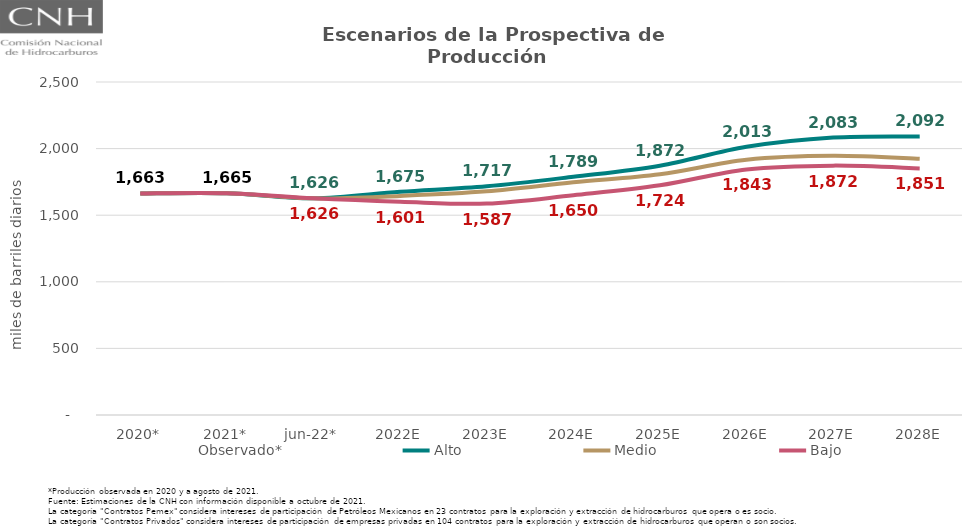
| Category | Observado* | Alto | Medio | Bajo |
|---|---|---|---|---|
| 2020* | 1663.042 | 1663.042 | 1663.042 | 1663.042 |
| 2021* | 1664.708 | 1664.708 | 1664.708 | 1664.708 |
| jun-22* | 1626.428 | 1626.428 | 1626.428 | 1626.428 |
| 2022E | 1644.93 | 1675.409 | 1644.93 | 1601.144 |
| 2023E | 1679.08 | 1716.756 | 1679.08 | 1587.114 |
| 2024E | 1746.672 | 1788.584 | 1746.672 | 1650.014 |
| 2025E | 1807.591 | 1871.92 | 1807.591 | 1724.282 |
| 2026E | 1915.996 | 2013.387 | 1915.996 | 1843.205 |
| 2027E | 1945.473 | 2083.109 | 1945.473 | 1872.17 |
| 2028E | 1923.08 | 2091.513 | 1923.08 | 1851.363 |